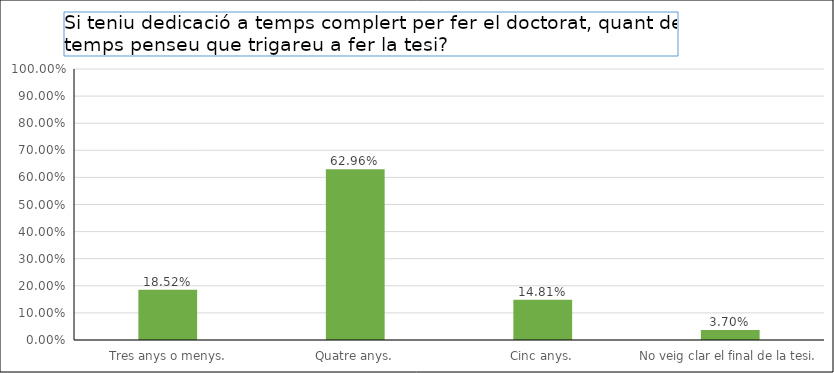
| Category | Series 0 |
|---|---|
|  Tres anys o menys. | 0.185 |
| Quatre anys. | 0.63 |
| Cinc anys. | 0.148 |
| No veig clar el final de la tesi. | 0.037 |